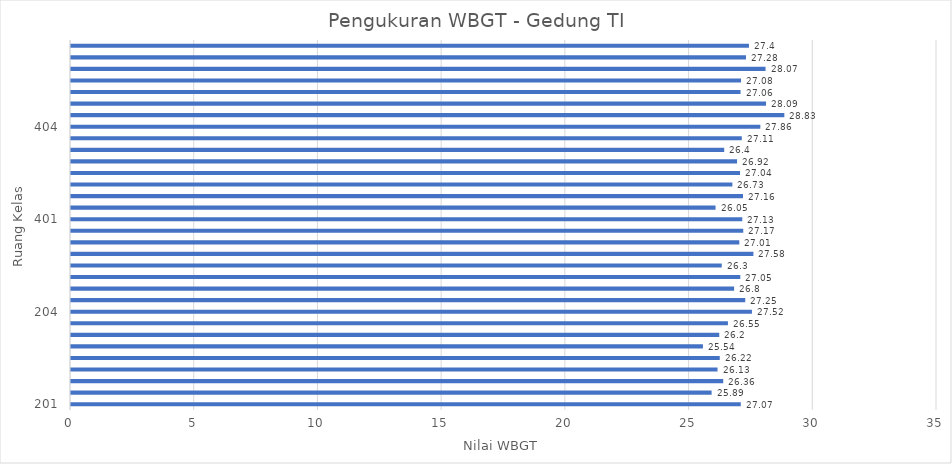
| Category | Series 0 |
|---|---|
| 201.0 | 27.07 |
| nan | 25.89 |
| nan | 26.36 |
| nan | 26.13 |
| nan | 26.22 |
| nan | 25.54 |
| nan | 26.2 |
| nan | 26.55 |
| 204.0 | 27.52 |
| nan | 27.25 |
| nan | 26.8 |
| nan | 27.05 |
| nan | 26.3 |
| nan | 27.58 |
| nan | 27.01 |
| nan | 27.17 |
| 401.0 | 27.13 |
| nan | 26.05 |
| nan | 27.16 |
| nan | 26.73 |
| nan | 27.04 |
| nan | 26.92 |
| nan | 26.4 |
| nan | 27.11 |
| 404.0 | 27.86 |
| nan | 28.83 |
| nan | 28.09 |
| nan | 27.06 |
| nan | 27.08 |
| nan | 28.07 |
| nan | 27.28 |
| nan | 27.4 |